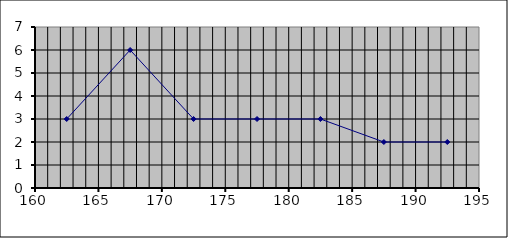
| Category | Series 0 |
|---|---|
| 162.5 | 3 |
| 167.5 | 6 |
| 172.5 | 3 |
| 177.5 | 3 |
| 182.5 | 3 |
| 187.5 | 2 |
| 192.5 | 2 |